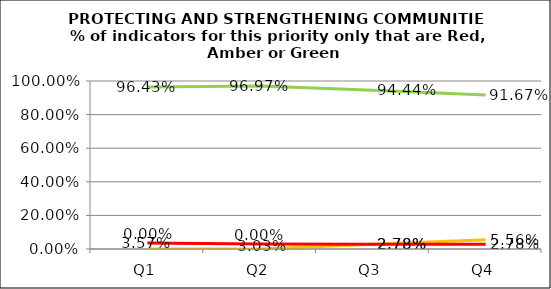
| Category | Green | Amber | Red |
|---|---|---|---|
| Q1 | 0.964 | 0 | 0.036 |
| Q2 | 0.97 | 0 | 0.03 |
| Q3 | 0.944 | 0.028 | 0.028 |
| Q4 | 0.917 | 0.056 | 0.028 |